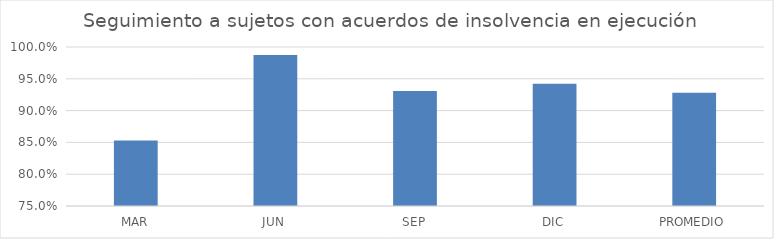
| Category | Series 0 |
|---|---|
| MAR | 0.853 |
| JUN | 0.987 |
| SEP | 0.931 |
| DIC | 0.942 |
| PROMEDIO | 0.928 |